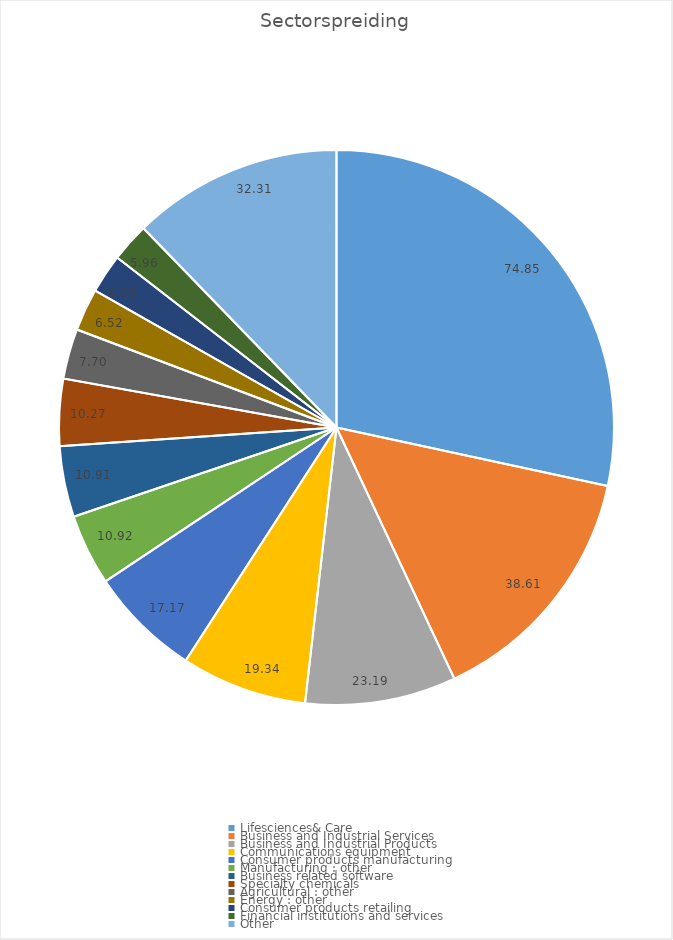
| Category | Series 0 |
|---|---|
| Lifesciences& Care | 74.852 |
| Business and Industrial Services | 38.609 |
| Business and Industrial Products | 23.191 |
| Communications equipment | 19.336 |
| Consumer products manufacturing | 17.172 |
| Manufacturing : other | 10.923 |
| Business related software | 10.914 |
| Specialty chemicals | 10.27 |
| Agricultural : other | 7.7 |
| Energy : other | 6.52 |
| Consumer products retailing | 6.004 |
| Financial institutions and services | 5.964 |
| Other | 32.307 |